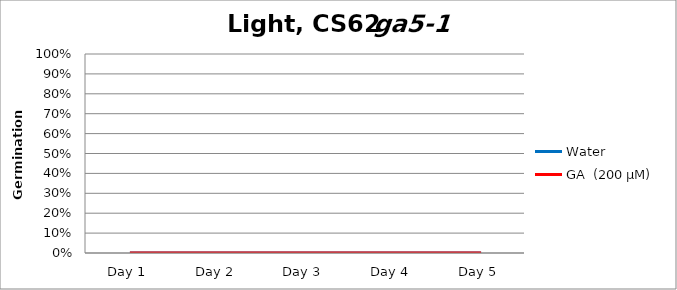
| Category | Water | GA  (200 µM)  |
|---|---|---|
| Day 1 | 0 | 0 |
| Day 2 | 0 | 0 |
| Day 3 | 0 | 0 |
| Day 4 | 0 | 0 |
| Day 5 | 0 | 0 |